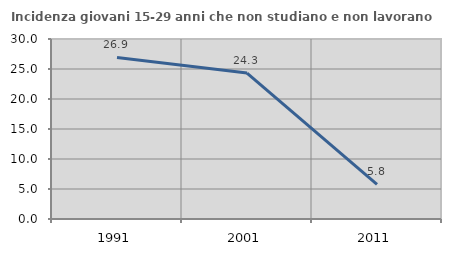
| Category | Incidenza giovani 15-29 anni che non studiano e non lavorano  |
|---|---|
| 1991.0 | 26.923 |
| 2001.0 | 24.324 |
| 2011.0 | 5.769 |